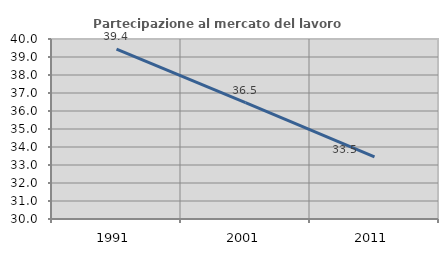
| Category | Partecipazione al mercato del lavoro  femminile |
|---|---|
| 1991.0 | 39.433 |
| 2001.0 | 36.46 |
| 2011.0 | 33.454 |